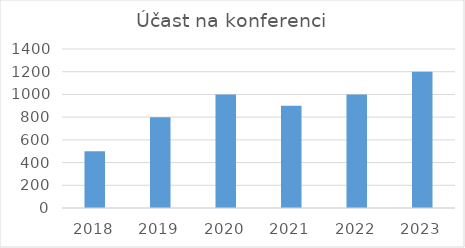
| Category | Účast na konferenci |
|---|---|
| 2018.0 | 500 |
| 2019.0 | 800 |
| 2020.0 | 1000 |
| 2021.0 | 900 |
| 2022.0 | 1000 |
| 2023.0 | 1200 |